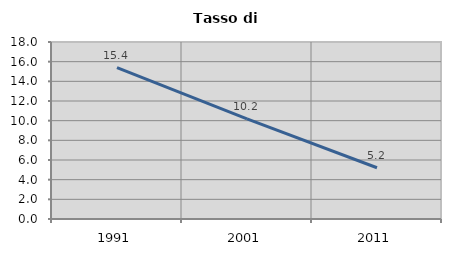
| Category | Tasso di disoccupazione   |
|---|---|
| 1991.0 | 15.385 |
| 2001.0 | 10.173 |
| 2011.0 | 5.21 |